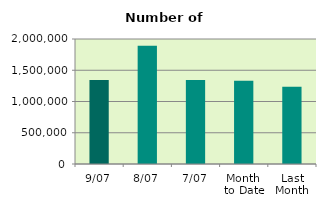
| Category | Series 0 |
|---|---|
| 9/07 | 1343964 |
| 8/07 | 1890608 |
| 7/07 | 1345558 |
| Month 
to Date | 1330172.857 |
| Last
Month | 1237407.909 |